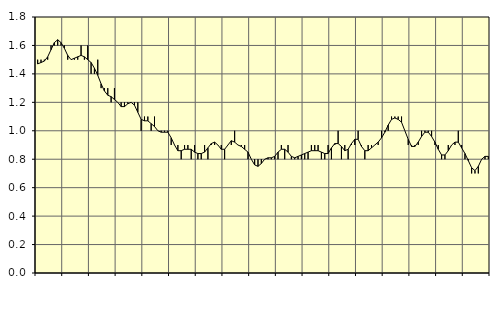
| Category | Piggar | Jordbruk, skogsbruk o fiske, SNI 01-03 |
|---|---|---|
| nan | 1.5 | 1.47 |
| 87.0 | 1.5 | 1.48 |
| 87.0 | 1.5 | 1.49 |
| 87.0 | 1.5 | 1.52 |
| nan | 1.6 | 1.57 |
| 88.0 | 1.6 | 1.62 |
| 88.0 | 1.6 | 1.64 |
| 88.0 | 1.6 | 1.62 |
| nan | 1.6 | 1.58 |
| 89.0 | 1.5 | 1.53 |
| 89.0 | 1.5 | 1.5 |
| 89.0 | 1.5 | 1.51 |
| nan | 1.5 | 1.52 |
| 90.0 | 1.6 | 1.53 |
| 90.0 | 1.5 | 1.52 |
| 90.0 | 1.6 | 1.5 |
| nan | 1.4 | 1.48 |
| 91.0 | 1.4 | 1.44 |
| 91.0 | 1.5 | 1.39 |
| 91.0 | 1.3 | 1.33 |
| nan | 1.3 | 1.28 |
| 92.0 | 1.3 | 1.25 |
| 92.0 | 1.2 | 1.24 |
| 92.0 | 1.3 | 1.22 |
| nan | 1.2 | 1.2 |
| 93.0 | 1.2 | 1.17 |
| 93.0 | 1.2 | 1.17 |
| 93.0 | 1.2 | 1.19 |
| nan | 1.2 | 1.2 |
| 94.0 | 1.2 | 1.18 |
| 94.0 | 1.2 | 1.13 |
| 94.0 | 1 | 1.08 |
| nan | 1.1 | 1.07 |
| 95.0 | 1.1 | 1.07 |
| 95.0 | 1 | 1.05 |
| 95.0 | 1.1 | 1.03 |
| nan | 1 | 1 |
| 96.0 | 1 | 0.99 |
| 96.0 | 1 | 0.99 |
| 96.0 | 1 | 0.99 |
| nan | 0.9 | 0.95 |
| 97.0 | 0.9 | 0.9 |
| 97.0 | 0.9 | 0.86 |
| 97.0 | 0.8 | 0.86 |
| nan | 0.9 | 0.87 |
| 98.0 | 0.9 | 0.87 |
| 98.0 | 0.8 | 0.87 |
| 98.0 | 0.9 | 0.85 |
| nan | 0.8 | 0.84 |
| 99.0 | 0.8 | 0.84 |
| 99.0 | 0.9 | 0.85 |
| 99.0 | 0.8 | 0.88 |
| nan | 0.9 | 0.91 |
| 0.0 | 0.9 | 0.92 |
| 0.0 | 0.9 | 0.9 |
| 0.0 | 0.9 | 0.87 |
| nan | 0.8 | 0.87 |
| 1.0 | 0.9 | 0.9 |
| 1.0 | 0.9 | 0.93 |
| 1.0 | 1 | 0.92 |
| nan | 0.9 | 0.9 |
| 2.0 | 0.9 | 0.89 |
| 2.0 | 0.9 | 0.87 |
| 2.0 | 0.8 | 0.85 |
| nan | 0.8 | 0.8 |
| 3.0 | 0.8 | 0.76 |
| 3.0 | 0.8 | 0.75 |
| 3.0 | 0.8 | 0.77 |
| nan | 0.8 | 0.8 |
| 4.0 | 0.8 | 0.81 |
| 4.0 | 0.8 | 0.81 |
| 4.0 | 0.8 | 0.82 |
| nan | 0.8 | 0.85 |
| 5.0 | 0.9 | 0.87 |
| 5.0 | 0.8 | 0.87 |
| 5.0 | 0.9 | 0.85 |
| nan | 0.8 | 0.82 |
| 6.0 | 0.8 | 0.81 |
| 6.0 | 0.8 | 0.82 |
| 6.0 | 0.8 | 0.83 |
| nan | 0.8 | 0.84 |
| 7.0 | 0.8 | 0.85 |
| 7.0 | 0.9 | 0.86 |
| 7.0 | 0.9 | 0.86 |
| nan | 0.9 | 0.86 |
| 8.0 | 0.8 | 0.85 |
| 8.0 | 0.8 | 0.84 |
| 8.0 | 0.9 | 0.84 |
| nan | 0.8 | 0.88 |
| 9.0 | 0.9 | 0.91 |
| 9.0 | 1 | 0.91 |
| 9.0 | 0.8 | 0.89 |
| nan | 0.9 | 0.86 |
| 10.0 | 0.8 | 0.87 |
| 10.0 | 0.9 | 0.91 |
| 10.0 | 0.9 | 0.94 |
| nan | 1 | 0.94 |
| 11.0 | 0.9 | 0.89 |
| 11.0 | 0.8 | 0.86 |
| 11.0 | 0.9 | 0.86 |
| nan | 0.9 | 0.88 |
| 12.0 | 0.9 | 0.9 |
| 12.0 | 0.9 | 0.92 |
| 12.0 | 1 | 0.95 |
| nan | 1 | 0.99 |
| 13.0 | 1 | 1.04 |
| 13.0 | 1.1 | 1.08 |
| 13.0 | 1.1 | 1.09 |
| nan | 1.1 | 1.08 |
| 14.0 | 1.1 | 1.06 |
| 14.0 | 1 | 1 |
| 14.0 | 0.9 | 0.94 |
| nan | 0.9 | 0.89 |
| 15.0 | 0.9 | 0.89 |
| 15.0 | 0.9 | 0.92 |
| 15.0 | 1 | 0.96 |
| nan | 1 | 0.99 |
| 16.0 | 1 | 0.99 |
| 16.0 | 1 | 0.96 |
| 16.0 | 0.9 | 0.92 |
| nan | 0.9 | 0.87 |
| 17.0 | 0.8 | 0.83 |
| 17.0 | 0.8 | 0.83 |
| 17.0 | 0.9 | 0.86 |
| nan | 0.9 | 0.9 |
| 18.0 | 0.9 | 0.92 |
| 18.0 | 1 | 0.92 |
| 18.0 | 0.9 | 0.88 |
| nan | 0.8 | 0.84 |
| 19.0 | 0.8 | 0.79 |
| 19.0 | 0.7 | 0.74 |
| 19.0 | 0.7 | 0.72 |
| nan | 0.7 | 0.75 |
| 20.0 | 0.8 | 0.8 |
| 20.0 | 0.8 | 0.82 |
| 20.0 | 0.8 | 0.82 |